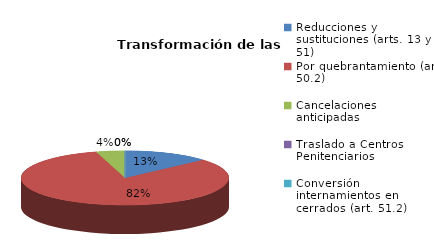
| Category | Series 0 |
|---|---|
| Reducciones y sustituciones (arts. 13 y 51) | 6 |
| Por quebrantamiento (art. 50.2) | 37 |
| Cancelaciones anticipadas | 2 |
| Traslado a Centros Penitenciarios | 0 |
| Conversión internamientos en cerrados (art. 51.2) | 0 |